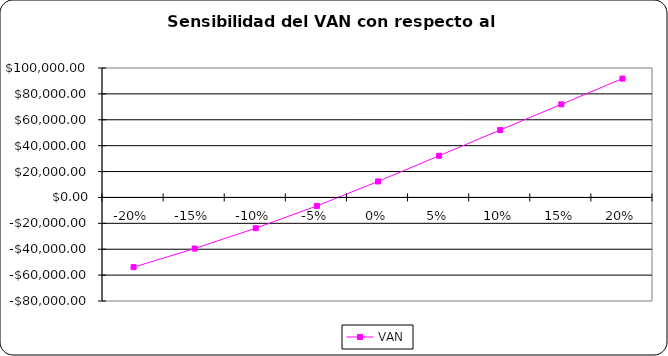
| Category | VAN |
|---|---|
| -0.2 | -53864.5 |
| -0.15 | -39469 |
| -0.1 | -23766.5 |
| -0.05 | -6567.7 |
| 0.0 | 12351.1 |
| 0.05 | 32215.7 |
| 0.1 | 52080 |
| 0.15 | 71945 |
| 0.2 | 91809.8 |